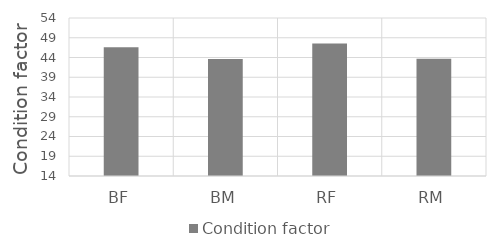
| Category | Condition factor |
|---|---|
| BF | 46.602 |
| BM | 43.642 |
| RF | 47.537 |
| RM | 43.706 |